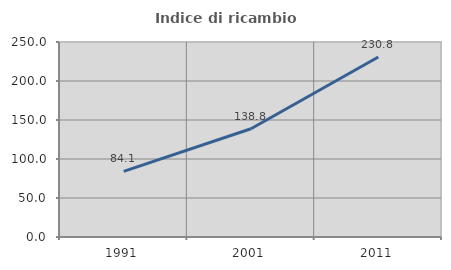
| Category | Indice di ricambio occupazionale  |
|---|---|
| 1991.0 | 84.095 |
| 2001.0 | 138.762 |
| 2011.0 | 230.831 |